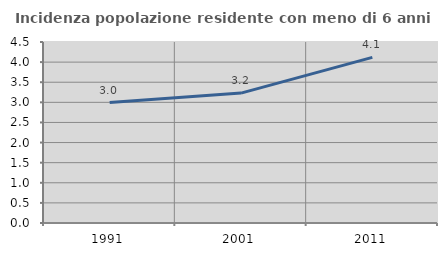
| Category | Incidenza popolazione residente con meno di 6 anni |
|---|---|
| 1991.0 | 2.993 |
| 2001.0 | 3.23 |
| 2011.0 | 4.117 |